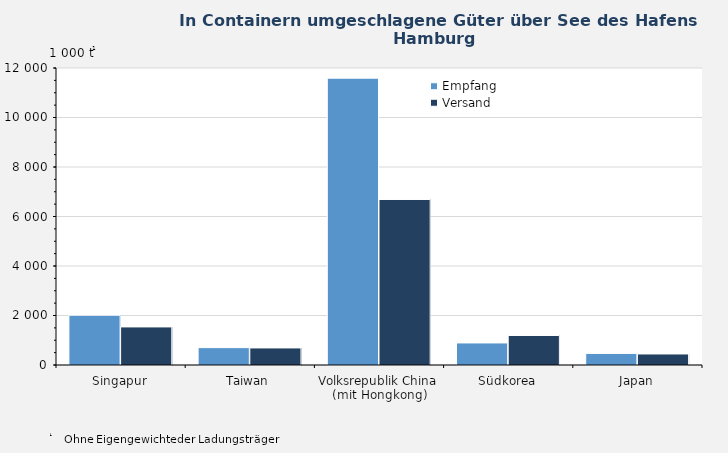
| Category | Empfang | Versand |
|---|---|---|
| Singapur | 2011 | 1539 |
| Taiwan | 701 | 690 |
| Volksrepublik China 
(mit Hongkong) | 11589 | 6687 |
| Südkorea | 891 | 1192 |
| Japan | 468 | 446 |